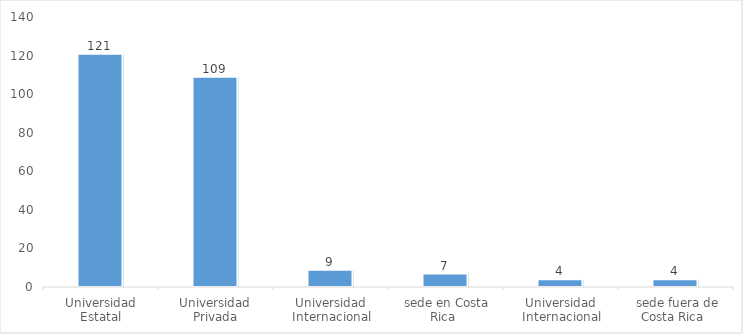
| Category | Total |
|---|---|
| Universidad Estatal | 121 |
| Universidad Privada | 109 |
| Universidad Internacional, sede en Costa Rica  | 9 |
| Universidad Internacional, sede fuera de Costa Rica  | 7 |
| Parauniversitaria Estatal | 4 |
| Parauniversitaria Privada | 4 |